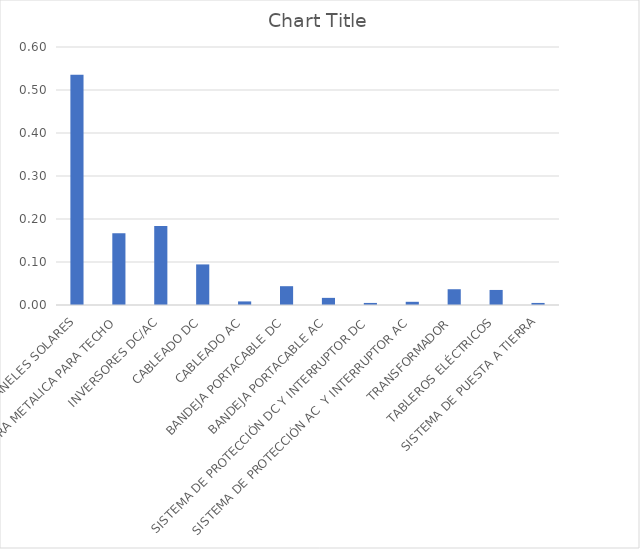
| Category | Series 0 |
|---|---|
| PANELES SOLARES | 0.535 |
| ESTRUCTURA METALICA PARA TECHO | 0.167 |
| INVERSORES DC/AC | 0.184 |
| CABLEADO DC | 0.094 |
| CABLEADO AC | 0.008 |
| BANDEJA PORTACABLE DC | 0.044 |
| BANDEJA PORTACABLE AC | 0.017 |
| SISTEMA DE PROTECCIÓN DC Y INTERRUPTOR DC | 0.005 |
| SISTEMA DE PROTECCIÓN AC  Y INTERRUPTOR AC | 0.007 |
| TRANSFORMADOR | 0.037 |
| TABLEROS ELÉCTRICOS | 0.035 |
| SISTEMA DE PUESTA A TIERRA | 0.005 |